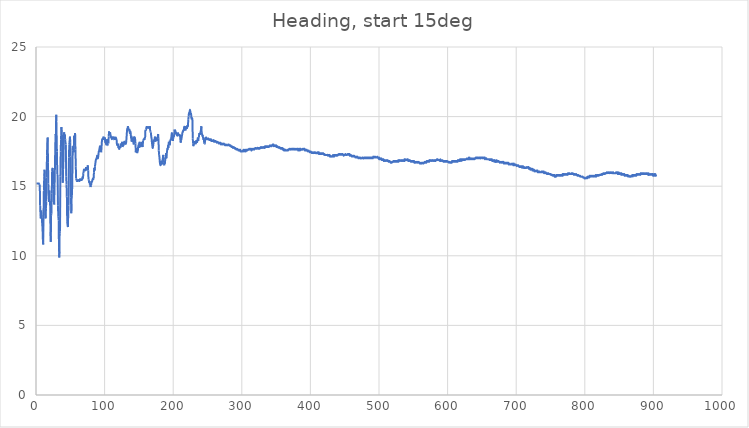
| Category | Column2 |
|---|---|
| 0.5 | 15.188 |
| 1.0 | 15.188 |
| 1.5 | 15.188 |
| 2.0 | 15.188 |
| 2.5 | 15.188 |
| 3.0 | 15.188 |
| 3.5 | 15.188 |
| 4.0 | 15.188 |
| 4.5 | 15.188 |
| 5.0 | 15.125 |
| 5.5 | 15.125 |
| 6.0 | 13.625 |
| 6.5 | 13 |
| 7.0 | 12.688 |
| 7.5 | 13.25 |
| 8.0 | 13.062 |
| 8.5 | 12.75 |
| 9.0 | 12.312 |
| 9.5 | 12 |
| 10.0 | 11.188 |
| 10.5 | 10.812 |
| 11.0 | 13 |
| 11.5 | 14.688 |
| 12.0 | 15.688 |
| 12.5 | 16.188 |
| 13.0 | 15.438 |
| 13.5 | 13 |
| 14.0 | 12.688 |
| 14.5 | 13.375 |
| 15.0 | 13.875 |
| 15.5 | 15.625 |
| 16.0 | 17.188 |
| 16.5 | 18.125 |
| 17.0 | 18.5 |
| 17.5 | 16.688 |
| 18.0 | 15.188 |
| 18.5 | 14.312 |
| 19.0 | 13.875 |
| 19.5 | 14.688 |
| 20.0 | 13.875 |
| 20.5 | 13.938 |
| 21.0 | 12.188 |
| 21.5 | 11 |
| 22.0 | 12.875 |
| 22.5 | 13.062 |
| 23.0 | 14.5 |
| 23.5 | 16.062 |
| 24.0 | 16.312 |
| 24.5 | 16.312 |
| 25.0 | 15.125 |
| 25.5 | 14.75 |
| 26.0 | 14 |
| 26.5 | 13.688 |
| 27.0 | 14.875 |
| 27.5 | 16.125 |
| 28.0 | 17.562 |
| 28.5 | 18.75 |
| 29.0 | 18.688 |
| 29.5 | 20.125 |
| 30.0 | 18.812 |
| 30.5 | 17.5 |
| 31.0 | 15.875 |
| 31.5 | 15.812 |
| 32.0 | 13.625 |
| 32.5 | 12.812 |
| 33.0 | 12.562 |
| 33.5 | 10.625 |
| 34.0 | 9.875 |
| 34.5 | 11.625 |
| 35.0 | 11.75 |
| 35.5 | 15.688 |
| 36.0 | 17.5 |
| 36.5 | 18.375 |
| 37.0 | 19.25 |
| 37.5 | 19.062 |
| 38.0 | 18.25 |
| 38.5 | 16.125 |
| 39.0 | 15.25 |
| 39.5 | 16.188 |
| 40.0 | 16.875 |
| 40.5 | 18.25 |
| 41.0 | 18.875 |
| 41.5 | 18.75 |
| 42.0 | 18.75 |
| 42.5 | 18.375 |
| 43.0 | 18.125 |
| 43.5 | 18 |
| 44.0 | 15.688 |
| 44.5 | 15.125 |
| 45.0 | 14.25 |
| 45.5 | 12.438 |
| 46.0 | 12.188 |
| 46.5 | 12.062 |
| 47.0 | 13 |
| 47.5 | 13.625 |
| 48.0 | 17.062 |
| 48.5 | 18 |
| 49.0 | 18.25 |
| 49.5 | 18.562 |
| 50.0 | 18.125 |
| 50.5 | 17.125 |
| 51.0 | 14.188 |
| 51.5 | 13.062 |
| 52.0 | 14.25 |
| 52.5 | 14.312 |
| 53.0 | 15.812 |
| 53.5 | 17.562 |
| 54.0 | 17.875 |
| 54.5 | 17.875 |
| 55.0 | 17.438 |
| 55.5 | 18.625 |
| 56.0 | 18.188 |
| 56.5 | 18.5 |
| 57.0 | 18.812 |
| 57.5 | 17.625 |
| 58.0 | 16.438 |
| 58.5 | 15.562 |
| 59.0 | 15.438 |
| 59.5 | 15.375 |
| 60.0 | 15.375 |
| 60.5 | 15.375 |
| 61.0 | 15.438 |
| 61.5 | 15.438 |
| 62.0 | 15.438 |
| 62.5 | 15.375 |
| 63.0 | 15.438 |
| 63.5 | 15.375 |
| 64.0 | 15.5 |
| 64.5 | 15.438 |
| 65.0 | 15.5 |
| 65.5 | 15.438 |
| 66.0 | 15.5 |
| 66.5 | 15.438 |
| 67.0 | 15.5 |
| 67.5 | 15.5 |
| 68.0 | 15.688 |
| 68.5 | 15.562 |
| 69.0 | 15.938 |
| 69.5 | 16.062 |
| 70.0 | 16.25 |
| 70.5 | 16.125 |
| 71.0 | 16.188 |
| 71.5 | 16.125 |
| 72.0 | 16.188 |
| 72.5 | 16.125 |
| 73.0 | 16.375 |
| 73.5 | 16.188 |
| 74.0 | 16.25 |
| 74.5 | 16.188 |
| 75.0 | 16.188 |
| 75.5 | 16.5 |
| 76.0 | 16.125 |
| 76.5 | 15.5 |
| 77.0 | 15.438 |
| 77.5 | 15.25 |
| 78.0 | 15.375 |
| 78.5 | 15.125 |
| 79.0 | 15.188 |
| 79.5 | 14.938 |
| 80.0 | 15.062 |
| 80.5 | 15.125 |
| 81.0 | 15.312 |
| 81.5 | 15.312 |
| 82.0 | 15.375 |
| 82.5 | 15.5 |
| 83.0 | 15.562 |
| 83.5 | 15.5 |
| 84.0 | 15.562 |
| 84.5 | 16 |
| 85.0 | 16.312 |
| 85.5 | 16.125 |
| 86.0 | 16.438 |
| 86.5 | 16.625 |
| 87.0 | 16.812 |
| 87.5 | 16.938 |
| 88.0 | 16.938 |
| 88.5 | 17 |
| 89.0 | 17.188 |
| 89.5 | 17.125 |
| 90.0 | 17 |
| 90.5 | 17.062 |
| 91.0 | 17.25 |
| 91.5 | 17.5 |
| 92.0 | 17.5 |
| 92.5 | 17.688 |
| 93.0 | 17.812 |
| 93.5 | 17.875 |
| 94.0 | 17.75 |
| 94.5 | 17.625 |
| 95.0 | 17.438 |
| 95.5 | 17.75 |
| 96.0 | 18.188 |
| 96.5 | 18.375 |
| 97.0 | 18.375 |
| 97.5 | 18.438 |
| 98.0 | 18.438 |
| 98.5 | 18.562 |
| 99.0 | 18.312 |
| 99.5 | 18.312 |
| 100.0 | 18.375 |
| 100.5 | 18.5 |
| 101.0 | 18.125 |
| 101.5 | 18.25 |
| 102.0 | 18 |
| 102.5 | 18.062 |
| 103.0 | 17.938 |
| 103.5 | 18.375 |
| 104.0 | 17.938 |
| 104.5 | 17.938 |
| 105.0 | 18.062 |
| 105.5 | 18.062 |
| 106.0 | 18.562 |
| 106.5 | 18.938 |
| 107.0 | 18.688 |
| 107.5 | 18.75 |
| 108.0 | 18.875 |
| 108.5 | 18.688 |
| 109.0 | 18.625 |
| 109.5 | 18.5 |
| 110.0 | 18.5 |
| 110.5 | 18.375 |
| 111.0 | 18.5 |
| 111.5 | 18.375 |
| 112.0 | 18.562 |
| 112.5 | 18.375 |
| 113.0 | 18.375 |
| 113.5 | 18.5 |
| 114.0 | 18.438 |
| 114.5 | 18.5 |
| 115.0 | 18.375 |
| 115.5 | 18.5 |
| 116.0 | 18.375 |
| 116.5 | 18.5 |
| 117.0 | 18.375 |
| 117.5 | 18.312 |
| 118.0 | 18 |
| 118.5 | 17.938 |
| 119.0 | 18 |
| 119.5 | 18.062 |
| 120.0 | 17.75 |
| 120.5 | 17.75 |
| 121.0 | 17.688 |
| 121.5 | 17.688 |
| 122.0 | 17.812 |
| 122.5 | 17.75 |
| 123.0 | 17.75 |
| 123.5 | 18.062 |
| 124.0 | 17.938 |
| 124.5 | 18 |
| 125.0 | 18 |
| 125.5 | 18.188 |
| 126.0 | 17.812 |
| 126.5 | 18 |
| 127.0 | 18 |
| 127.5 | 17.938 |
| 128.0 | 18.062 |
| 128.5 | 18.188 |
| 129.0 | 18.188 |
| 129.5 | 18.188 |
| 130.0 | 18 |
| 130.5 | 18.125 |
| 131.0 | 18.062 |
| 131.5 | 18.188 |
| 132.0 | 18.5 |
| 132.5 | 18.875 |
| 133.0 | 19.125 |
| 133.5 | 19.125 |
| 134.0 | 19.312 |
| 134.5 | 19.188 |
| 135.0 | 19.062 |
| 135.5 | 19.062 |
| 136.0 | 19.125 |
| 136.5 | 18.875 |
| 137.0 | 18.812 |
| 137.5 | 18.938 |
| 138.0 | 18.875 |
| 138.5 | 18.438 |
| 139.0 | 18.625 |
| 139.5 | 18.188 |
| 140.0 | 18.5 |
| 140.5 | 18.25 |
| 141.0 | 18.438 |
| 141.5 | 18.188 |
| 142.0 | 18.25 |
| 142.5 | 18 |
| 143.0 | 18.562 |
| 143.5 | 18.438 |
| 144.0 | 18.5 |
| 144.5 | 18.375 |
| 145.0 | 18.062 |
| 145.5 | 17.438 |
| 146.0 | 17.75 |
| 146.5 | 17.438 |
| 147.0 | 17.625 |
| 147.5 | 17.375 |
| 148.0 | 17.5 |
| 148.5 | 17.562 |
| 149.0 | 17.875 |
| 149.5 | 17.938 |
| 150.0 | 18.062 |
| 150.5 | 17.75 |
| 151.0 | 18.188 |
| 151.5 | 18 |
| 152.0 | 17.938 |
| 152.5 | 17.875 |
| 153.0 | 17.938 |
| 153.5 | 18 |
| 154.0 | 18.125 |
| 154.5 | 18.062 |
| 155.0 | 17.875 |
| 155.5 | 17.812 |
| 156.0 | 18.25 |
| 156.5 | 18.312 |
| 157.0 | 18.375 |
| 157.5 | 18.375 |
| 158.0 | 18.438 |
| 158.5 | 18.375 |
| 159.0 | 18.438 |
| 159.5 | 19.062 |
| 160.0 | 19.062 |
| 160.5 | 19.062 |
| 161.0 | 19.25 |
| 161.5 | 19.188 |
| 162.0 | 19.25 |
| 162.5 | 19.188 |
| 163.0 | 19.25 |
| 163.5 | 19.188 |
| 164.0 | 19.25 |
| 164.5 | 19.188 |
| 165.0 | 19.25 |
| 165.5 | 19.188 |
| 166.0 | 19.312 |
| 166.5 | 18.938 |
| 167.0 | 18.875 |
| 167.5 | 18.812 |
| 168.0 | 18.562 |
| 168.5 | 18.438 |
| 169.0 | 18.125 |
| 169.5 | 17.938 |
| 170.0 | 17.75 |
| 170.5 | 17.812 |
| 171.0 | 18 |
| 171.5 | 18.188 |
| 172.0 | 18.312 |
| 172.5 | 18.25 |
| 173.0 | 18.438 |
| 173.5 | 18.562 |
| 174.0 | 18.312 |
| 174.5 | 18.25 |
| 175.0 | 18.438 |
| 175.5 | 18.375 |
| 176.0 | 18.438 |
| 176.5 | 18.25 |
| 177.0 | 18.438 |
| 177.5 | 18.562 |
| 178.0 | 18.75 |
| 178.5 | 18.438 |
| 179.0 | 17.562 |
| 179.5 | 17.25 |
| 180.0 | 17.062 |
| 180.5 | 16.75 |
| 181.0 | 16.562 |
| 181.5 | 16.5 |
| 182.0 | 16.562 |
| 182.5 | 16.812 |
| 183.0 | 16.625 |
| 183.5 | 16.562 |
| 184.0 | 16.875 |
| 184.5 | 16.875 |
| 185.0 | 17.062 |
| 185.5 | 17.25 |
| 186.0 | 16.688 |
| 186.5 | 16.562 |
| 187.0 | 16.5 |
| 187.5 | 16.75 |
| 188.0 | 16.625 |
| 188.5 | 17.062 |
| 189.0 | 17 |
| 189.5 | 17.375 |
| 190.0 | 17 |
| 190.5 | 17.25 |
| 191.0 | 17.5 |
| 191.5 | 17.688 |
| 192.0 | 17.625 |
| 192.5 | 17.938 |
| 193.0 | 17.75 |
| 193.5 | 18.188 |
| 194.0 | 18.188 |
| 194.5 | 18.188 |
| 195.0 | 17.938 |
| 195.5 | 18.25 |
| 196.0 | 18.312 |
| 196.5 | 18.375 |
| 197.0 | 18.375 |
| 197.5 | 18.625 |
| 198.0 | 18.812 |
| 198.5 | 18.75 |
| 199.0 | 18.625 |
| 199.5 | 18.25 |
| 200.0 | 18.438 |
| 200.5 | 18.562 |
| 201.0 | 18.562 |
| 201.5 | 18.75 |
| 202.0 | 19.062 |
| 202.5 | 18.938 |
| 203.0 | 19 |
| 203.5 | 18.812 |
| 204.0 | 18.875 |
| 204.5 | 18.812 |
| 205.0 | 18.688 |
| 205.5 | 18.688 |
| 206.0 | 18.625 |
| 206.5 | 18.688 |
| 207.0 | 18.812 |
| 207.5 | 18.75 |
| 208.0 | 18.688 |
| 208.5 | 18.688 |
| 209.0 | 18.625 |
| 209.5 | 18.688 |
| 210.0 | 18.625 |
| 210.5 | 18.312 |
| 211.0 | 18.125 |
| 211.5 | 18.312 |
| 212.0 | 18.375 |
| 212.5 | 18.562 |
| 213.0 | 18.688 |
| 213.5 | 18.875 |
| 214.0 | 18.875 |
| 214.5 | 19 |
| 215.0 | 19 |
| 215.5 | 19.062 |
| 216.0 | 19.25 |
| 216.5 | 19.25 |
| 217.0 | 19.125 |
| 217.5 | 19.125 |
| 218.0 | 19 |
| 218.5 | 19.312 |
| 219.0 | 19.125 |
| 219.5 | 19.25 |
| 220.0 | 19.125 |
| 220.5 | 19.375 |
| 221.0 | 19.25 |
| 221.5 | 19.312 |
| 222.0 | 19.812 |
| 222.5 | 20 |
| 223.0 | 20.25 |
| 223.5 | 20.25 |
| 224.0 | 20.375 |
| 224.5 | 20.5 |
| 225.0 | 20.375 |
| 225.5 | 20.125 |
| 226.0 | 20.25 |
| 226.5 | 19.875 |
| 227.0 | 19.812 |
| 227.5 | 19.938 |
| 228.0 | 19.75 |
| 228.5 | 18.438 |
| 229.0 | 18.062 |
| 229.5 | 17.875 |
| 230.0 | 18.062 |
| 230.5 | 18.062 |
| 231.0 | 18.188 |
| 231.5 | 18.062 |
| 232.0 | 18.188 |
| 232.5 | 18.125 |
| 233.0 | 18.062 |
| 233.5 | 18.125 |
| 234.0 | 18.312 |
| 234.5 | 18.125 |
| 235.0 | 18.188 |
| 235.5 | 18.375 |
| 236.0 | 18.5 |
| 236.5 | 18.25 |
| 237.0 | 18.5 |
| 237.5 | 18.562 |
| 238.0 | 18.812 |
| 238.5 | 18.75 |
| 239.0 | 18.812 |
| 239.5 | 18.75 |
| 240.0 | 18.938 |
| 240.5 | 19.062 |
| 241.0 | 19.312 |
| 241.5 | 18.875 |
| 242.0 | 18.75 |
| 242.5 | 18.625 |
| 243.0 | 18.688 |
| 243.5 | 18.438 |
| 244.0 | 18.375 |
| 244.5 | 18.5 |
| 245.0 | 18.125 |
| 245.5 | 18.062 |
| 246.0 | 18.062 |
| 246.5 | 18.312 |
| 247.0 | 18.375 |
| 247.5 | 18.438 |
| 248.0 | 18.5 |
| 248.5 | 18.375 |
| 249.0 | 18.438 |
| 249.5 | 18.375 |
| 250.0 | 18.438 |
| 250.5 | 18.375 |
| 251.0 | 18.438 |
| 251.5 | 18.375 |
| 252.0 | 18.375 |
| 252.5 | 18.312 |
| 253.0 | 18.375 |
| 253.5 | 18.312 |
| 254.0 | 18.375 |
| 254.5 | 18.312 |
| 255.0 | 18.375 |
| 255.5 | 18.25 |
| 256.0 | 18.25 |
| 256.5 | 18.25 |
| 257.0 | 18.25 |
| 257.5 | 18.25 |
| 258.0 | 18.312 |
| 258.5 | 18.25 |
| 259.0 | 18.312 |
| 259.5 | 18.188 |
| 260.0 | 18.25 |
| 260.5 | 18.188 |
| 261.0 | 18.25 |
| 261.5 | 18.188 |
| 262.0 | 18.25 |
| 262.5 | 18.188 |
| 263.0 | 18.188 |
| 263.5 | 18.125 |
| 264.0 | 18.188 |
| 264.5 | 18.125 |
| 265.0 | 18.188 |
| 265.5 | 18.125 |
| 266.0 | 18.125 |
| 266.5 | 18.062 |
| 267.0 | 18.125 |
| 267.5 | 18.062 |
| 268.0 | 18.125 |
| 268.5 | 18.062 |
| 269.0 | 18.125 |
| 269.5 | 18 |
| 270.0 | 18.062 |
| 270.5 | 18 |
| 271.0 | 18.062 |
| 271.5 | 18 |
| 272.0 | 18.062 |
| 272.5 | 18 |
| 273.0 | 18.062 |
| 273.5 | 18 |
| 274.0 | 18.062 |
| 274.5 | 18 |
| 275.0 | 18 |
| 275.5 | 17.938 |
| 276.0 | 18 |
| 276.5 | 17.938 |
| 277.0 | 18 |
| 277.5 | 17.938 |
| 278.0 | 17.938 |
| 278.5 | 17.938 |
| 279.0 | 17.938 |
| 279.5 | 17.938 |
| 280.0 | 18 |
| 280.5 | 17.938 |
| 281.0 | 18 |
| 281.5 | 17.938 |
| 282.0 | 17.938 |
| 282.5 | 17.938 |
| 283.0 | 17.875 |
| 283.5 | 17.938 |
| 284.0 | 17.875 |
| 284.5 | 17.875 |
| 285.0 | 17.812 |
| 285.5 | 17.875 |
| 286.0 | 17.812 |
| 286.5 | 17.812 |
| 287.0 | 17.75 |
| 287.5 | 17.812 |
| 288.0 | 17.75 |
| 288.5 | 17.812 |
| 289.0 | 17.75 |
| 289.5 | 17.75 |
| 290.0 | 17.688 |
| 290.5 | 17.75 |
| 291.0 | 17.688 |
| 291.5 | 17.688 |
| 292.0 | 17.625 |
| 292.5 | 17.688 |
| 293.0 | 17.625 |
| 293.5 | 17.688 |
| 294.0 | 17.625 |
| 294.5 | 17.625 |
| 295.0 | 17.562 |
| 295.5 | 17.625 |
| 296.0 | 17.562 |
| 296.5 | 17.562 |
| 297.0 | 17.562 |
| 297.5 | 17.625 |
| 298.0 | 17.5 |
| 298.5 | 17.562 |
| 299.0 | 17.5 |
| 299.5 | 17.5 |
| 300.0 | 17.5 |
| 300.5 | 17.5 |
| 301.0 | 17.5 |
| 301.5 | 17.562 |
| 302.0 | 17.5 |
| 302.5 | 17.625 |
| 303.0 | 17.5 |
| 303.5 | 17.625 |
| 304.0 | 17.5 |
| 304.5 | 17.562 |
| 305.0 | 17.5 |
| 305.5 | 17.625 |
| 306.0 | 17.5 |
| 306.5 | 17.625 |
| 307.0 | 17.562 |
| 307.5 | 17.625 |
| 308.0 | 17.562 |
| 308.5 | 17.625 |
| 309.0 | 17.625 |
| 309.5 | 17.625 |
| 310.0 | 17.625 |
| 310.5 | 17.688 |
| 311.0 | 17.625 |
| 311.5 | 17.688 |
| 312.0 | 17.625 |
| 312.5 | 17.688 |
| 313.0 | 17.625 |
| 313.5 | 17.688 |
| 314.0 | 17.562 |
| 314.5 | 17.625 |
| 315.0 | 17.625 |
| 315.5 | 17.688 |
| 316.0 | 17.625 |
| 316.5 | 17.688 |
| 317.0 | 17.625 |
| 317.5 | 17.688 |
| 318.0 | 17.625 |
| 318.5 | 17.688 |
| 319.0 | 17.688 |
| 319.5 | 17.75 |
| 320.0 | 17.688 |
| 320.5 | 17.75 |
| 321.0 | 17.688 |
| 321.5 | 17.688 |
| 322.0 | 17.688 |
| 322.5 | 17.75 |
| 323.0 | 17.75 |
| 323.5 | 17.75 |
| 324.0 | 17.688 |
| 324.5 | 17.75 |
| 325.0 | 17.688 |
| 325.5 | 17.75 |
| 326.0 | 17.688 |
| 326.5 | 17.75 |
| 327.0 | 17.75 |
| 327.5 | 17.812 |
| 328.0 | 17.75 |
| 328.5 | 17.75 |
| 329.0 | 17.812 |
| 329.5 | 17.75 |
| 330.0 | 17.812 |
| 330.5 | 17.75 |
| 331.0 | 17.812 |
| 331.5 | 17.75 |
| 332.0 | 17.812 |
| 332.5 | 17.75 |
| 333.0 | 17.812 |
| 333.5 | 17.75 |
| 334.0 | 17.875 |
| 334.5 | 17.812 |
| 335.0 | 17.875 |
| 335.5 | 17.812 |
| 336.0 | 17.875 |
| 336.5 | 17.812 |
| 337.0 | 17.875 |
| 337.5 | 17.812 |
| 338.0 | 17.875 |
| 338.5 | 17.812 |
| 339.0 | 17.875 |
| 339.5 | 17.812 |
| 340.0 | 17.875 |
| 340.5 | 17.875 |
| 341.0 | 17.938 |
| 341.5 | 17.875 |
| 342.0 | 17.938 |
| 342.5 | 17.875 |
| 343.0 | 17.875 |
| 343.5 | 17.875 |
| 344.0 | 17.938 |
| 344.5 | 17.938 |
| 345.0 | 18 |
| 345.5 | 17.938 |
| 346.0 | 18 |
| 346.5 | 17.875 |
| 347.0 | 17.938 |
| 347.5 | 17.875 |
| 348.0 | 17.938 |
| 348.5 | 17.875 |
| 349.0 | 17.938 |
| 349.5 | 17.875 |
| 350.0 | 17.938 |
| 350.5 | 17.812 |
| 351.0 | 17.875 |
| 351.5 | 17.812 |
| 352.0 | 17.875 |
| 352.5 | 17.812 |
| 353.0 | 17.812 |
| 353.5 | 17.75 |
| 354.0 | 17.812 |
| 354.5 | 17.75 |
| 355.0 | 17.812 |
| 355.5 | 17.75 |
| 356.0 | 17.75 |
| 356.5 | 17.688 |
| 357.0 | 17.75 |
| 357.5 | 17.688 |
| 358.0 | 17.75 |
| 358.5 | 17.688 |
| 359.0 | 17.75 |
| 359.5 | 17.625 |
| 360.0 | 17.688 |
| 360.5 | 17.625 |
| 361.0 | 17.688 |
| 361.5 | 17.562 |
| 362.0 | 17.625 |
| 362.5 | 17.562 |
| 363.0 | 17.625 |
| 363.5 | 17.562 |
| 364.0 | 17.625 |
| 364.5 | 17.562 |
| 365.0 | 17.562 |
| 365.5 | 17.562 |
| 366.0 | 17.562 |
| 366.5 | 17.562 |
| 367.0 | 17.625 |
| 367.5 | 17.562 |
| 368.0 | 17.625 |
| 368.5 | 17.625 |
| 369.0 | 17.688 |
| 369.5 | 17.625 |
| 370.0 | 17.688 |
| 370.5 | 17.625 |
| 371.0 | 17.688 |
| 371.5 | 17.625 |
| 372.0 | 17.688 |
| 372.5 | 17.625 |
| 373.0 | 17.688 |
| 373.5 | 17.625 |
| 374.0 | 17.688 |
| 374.5 | 17.688 |
| 375.0 | 17.688 |
| 375.5 | 17.688 |
| 376.0 | 17.625 |
| 376.5 | 17.688 |
| 377.0 | 17.625 |
| 377.5 | 17.688 |
| 378.0 | 17.625 |
| 378.5 | 17.688 |
| 379.0 | 17.625 |
| 379.5 | 17.688 |
| 380.0 | 17.625 |
| 380.5 | 17.688 |
| 381.0 | 17.625 |
| 381.5 | 17.688 |
| 382.0 | 17.562 |
| 382.5 | 17.688 |
| 383.0 | 17.562 |
| 383.5 | 17.688 |
| 384.0 | 17.562 |
| 384.5 | 17.688 |
| 385.0 | 17.562 |
| 385.5 | 17.688 |
| 386.0 | 17.625 |
| 386.5 | 17.625 |
| 387.0 | 17.625 |
| 387.5 | 17.625 |
| 388.0 | 17.625 |
| 388.5 | 17.688 |
| 389.0 | 17.625 |
| 389.5 | 17.688 |
| 390.0 | 17.625 |
| 390.5 | 17.688 |
| 391.0 | 17.625 |
| 391.5 | 17.688 |
| 392.0 | 17.562 |
| 392.5 | 17.625 |
| 393.0 | 17.562 |
| 393.5 | 17.625 |
| 394.0 | 17.562 |
| 394.5 | 17.625 |
| 395.0 | 17.562 |
| 395.5 | 17.562 |
| 396.0 | 17.5 |
| 396.5 | 17.562 |
| 397.0 | 17.5 |
| 397.5 | 17.562 |
| 398.0 | 17.5 |
| 398.5 | 17.5 |
| 399.0 | 17.438 |
| 399.5 | 17.5 |
| 400.0 | 17.438 |
| 400.5 | 17.5 |
| 401.0 | 17.438 |
| 401.5 | 17.438 |
| 402.0 | 17.375 |
| 402.5 | 17.438 |
| 403.0 | 17.375 |
| 403.5 | 17.438 |
| 404.0 | 17.375 |
| 404.5 | 17.438 |
| 405.0 | 17.375 |
| 405.5 | 17.438 |
| 406.0 | 17.375 |
| 406.5 | 17.438 |
| 407.0 | 17.375 |
| 407.5 | 17.438 |
| 408.0 | 17.375 |
| 408.5 | 17.375 |
| 409.0 | 17.375 |
| 409.5 | 17.375 |
| 410.0 | 17.375 |
| 410.5 | 17.438 |
| 411.0 | 17.375 |
| 411.5 | 17.438 |
| 412.0 | 17.312 |
| 412.5 | 17.438 |
| 413.0 | 17.312 |
| 413.5 | 17.375 |
| 414.0 | 17.312 |
| 414.5 | 17.375 |
| 415.0 | 17.312 |
| 415.5 | 17.375 |
| 416.0 | 17.312 |
| 416.5 | 17.375 |
| 417.0 | 17.312 |
| 417.5 | 17.375 |
| 418.0 | 17.312 |
| 418.5 | 17.375 |
| 419.0 | 17.312 |
| 419.5 | 17.312 |
| 420.0 | 17.25 |
| 420.5 | 17.312 |
| 421.0 | 17.25 |
| 421.5 | 17.25 |
| 422.0 | 17.25 |
| 422.5 | 17.25 |
| 423.0 | 17.25 |
| 423.5 | 17.25 |
| 424.0 | 17.25 |
| 424.5 | 17.25 |
| 425.0 | 17.25 |
| 425.5 | 17.188 |
| 426.0 | 17.25 |
| 426.5 | 17.188 |
| 427.0 | 17.25 |
| 427.5 | 17.188 |
| 428.0 | 17.25 |
| 428.5 | 17.125 |
| 429.0 | 17.188 |
| 429.5 | 17.125 |
| 430.0 | 17.125 |
| 430.5 | 17.125 |
| 431.0 | 17.125 |
| 431.5 | 17.125 |
| 432.0 | 17.188 |
| 432.5 | 17.125 |
| 433.0 | 17.25 |
| 433.5 | 17.125 |
| 434.0 | 17.188 |
| 434.5 | 17.125 |
| 435.0 | 17.25 |
| 435.5 | 17.188 |
| 436.0 | 17.25 |
| 436.5 | 17.188 |
| 437.0 | 17.25 |
| 437.5 | 17.188 |
| 438.0 | 17.25 |
| 438.5 | 17.188 |
| 439.0 | 17.25 |
| 439.5 | 17.188 |
| 440.0 | 17.25 |
| 440.5 | 17.25 |
| 441.0 | 17.312 |
| 441.5 | 17.25 |
| 442.0 | 17.312 |
| 442.5 | 17.25 |
| 443.0 | 17.312 |
| 443.5 | 17.25 |
| 444.0 | 17.312 |
| 444.5 | 17.25 |
| 445.0 | 17.312 |
| 445.5 | 17.25 |
| 446.0 | 17.312 |
| 446.5 | 17.25 |
| 447.0 | 17.312 |
| 447.5 | 17.25 |
| 448.0 | 17.25 |
| 448.5 | 17.188 |
| 449.0 | 17.25 |
| 449.5 | 17.25 |
| 450.0 | 17.25 |
| 450.5 | 17.25 |
| 451.0 | 17.312 |
| 451.5 | 17.25 |
| 452.0 | 17.25 |
| 452.5 | 17.25 |
| 453.0 | 17.25 |
| 453.5 | 17.25 |
| 454.0 | 17.312 |
| 454.5 | 17.25 |
| 455.0 | 17.312 |
| 455.5 | 17.25 |
| 456.0 | 17.312 |
| 456.5 | 17.25 |
| 457.0 | 17.312 |
| 457.5 | 17.188 |
| 458.0 | 17.25 |
| 458.5 | 17.188 |
| 459.0 | 17.25 |
| 459.5 | 17.188 |
| 460.0 | 17.188 |
| 460.5 | 17.125 |
| 461.0 | 17.188 |
| 461.5 | 17.125 |
| 462.0 | 17.188 |
| 462.5 | 17.125 |
| 463.0 | 17.188 |
| 463.5 | 17.125 |
| 464.0 | 17.188 |
| 464.5 | 17.125 |
| 465.0 | 17.125 |
| 465.5 | 17.062 |
| 466.0 | 17.125 |
| 466.5 | 17.062 |
| 467.0 | 17.125 |
| 467.5 | 17.062 |
| 468.0 | 17.062 |
| 468.5 | 17.125 |
| 469.0 | 17.062 |
| 469.5 | 17.062 |
| 470.0 | 17 |
| 470.5 | 17.062 |
| 471.0 | 17.062 |
| 471.5 | 17.062 |
| 472.0 | 17 |
| 472.5 | 17.062 |
| 473.0 | 17 |
| 473.5 | 17 |
| 474.0 | 17 |
| 474.5 | 17 |
| 475.0 | 17 |
| 475.5 | 17.062 |
| 476.0 | 17 |
| 476.5 | 17.062 |
| 477.0 | 17 |
| 477.5 | 17 |
| 478.0 | 17 |
| 478.5 | 17.062 |
| 479.0 | 17 |
| 479.5 | 17.062 |
| 480.0 | 17 |
| 480.5 | 17.062 |
| 481.0 | 17 |
| 481.5 | 17.062 |
| 482.0 | 17 |
| 482.5 | 17.062 |
| 483.0 | 17 |
| 483.5 | 17.062 |
| 484.0 | 17 |
| 484.5 | 17.062 |
| 485.0 | 17 |
| 485.5 | 17.062 |
| 486.0 | 17 |
| 486.5 | 17.062 |
| 487.0 | 17 |
| 487.5 | 17.062 |
| 488.0 | 17 |
| 488.5 | 17.062 |
| 489.0 | 17 |
| 489.5 | 17.062 |
| 490.0 | 17 |
| 490.5 | 17.062 |
| 491.0 | 17 |
| 491.5 | 17.125 |
| 492.0 | 17.062 |
| 492.5 | 17.125 |
| 493.0 | 17.062 |
| 493.5 | 17.125 |
| 494.0 | 17.062 |
| 494.5 | 17.125 |
| 495.0 | 17.062 |
| 495.5 | 17.062 |
| 496.0 | 17.062 |
| 496.5 | 17.062 |
| 497.0 | 17.062 |
| 497.5 | 17.125 |
| 498.0 | 17.062 |
| 498.5 | 17.062 |
| 499.0 | 17 |
| 499.5 | 17.062 |
| 500.0 | 16.938 |
| 500.5 | 17.062 |
| 501.0 | 16.938 |
| 501.5 | 17 |
| 502.0 | 16.938 |
| 502.5 | 17 |
| 503.0 | 16.938 |
| 503.5 | 17 |
| 504.0 | 16.875 |
| 504.5 | 16.938 |
| 505.0 | 16.875 |
| 505.5 | 16.938 |
| 506.0 | 16.875 |
| 506.5 | 16.938 |
| 507.0 | 16.812 |
| 507.5 | 16.875 |
| 508.0 | 16.812 |
| 508.5 | 16.875 |
| 509.0 | 16.812 |
| 509.5 | 16.875 |
| 510.0 | 16.812 |
| 510.5 | 16.875 |
| 511.0 | 16.812 |
| 511.5 | 16.875 |
| 512.0 | 16.812 |
| 512.5 | 16.875 |
| 513.0 | 16.812 |
| 513.5 | 16.812 |
| 514.0 | 16.75 |
| 514.5 | 16.812 |
| 515.0 | 16.75 |
| 515.5 | 16.812 |
| 516.0 | 16.75 |
| 516.5 | 16.75 |
| 517.0 | 16.688 |
| 517.5 | 16.688 |
| 518.0 | 16.688 |
| 518.5 | 16.688 |
| 519.0 | 16.75 |
| 519.5 | 16.75 |
| 520.0 | 16.75 |
| 520.5 | 16.75 |
| 521.0 | 16.812 |
| 521.5 | 16.75 |
| 522.0 | 16.812 |
| 522.5 | 16.75 |
| 523.0 | 16.812 |
| 523.5 | 16.75 |
| 524.0 | 16.812 |
| 524.5 | 16.75 |
| 525.0 | 16.812 |
| 525.5 | 16.75 |
| 526.0 | 16.812 |
| 526.5 | 16.75 |
| 527.0 | 16.812 |
| 527.5 | 16.75 |
| 528.0 | 16.875 |
| 528.5 | 16.75 |
| 529.0 | 16.875 |
| 529.5 | 16.812 |
| 530.0 | 16.875 |
| 530.5 | 16.812 |
| 531.0 | 16.875 |
| 531.5 | 16.812 |
| 532.0 | 16.875 |
| 532.5 | 16.812 |
| 533.0 | 16.875 |
| 533.5 | 16.812 |
| 534.0 | 16.875 |
| 534.5 | 16.812 |
| 535.0 | 16.875 |
| 535.5 | 16.812 |
| 536.0 | 16.875 |
| 536.5 | 16.812 |
| 537.0 | 16.938 |
| 537.5 | 16.812 |
| 538.0 | 16.938 |
| 538.5 | 16.875 |
| 539.0 | 16.875 |
| 539.5 | 16.875 |
| 540.0 | 16.875 |
| 540.5 | 16.875 |
| 541.0 | 16.938 |
| 541.5 | 16.875 |
| 542.0 | 16.938 |
| 542.5 | 16.812 |
| 543.0 | 16.875 |
| 543.5 | 16.812 |
| 544.0 | 16.875 |
| 544.5 | 16.812 |
| 545.0 | 16.875 |
| 545.5 | 16.812 |
| 546.0 | 16.812 |
| 546.5 | 16.75 |
| 547.0 | 16.812 |
| 547.5 | 16.75 |
| 548.0 | 16.812 |
| 548.5 | 16.75 |
| 549.0 | 16.812 |
| 549.5 | 16.75 |
| 550.0 | 16.812 |
| 550.5 | 16.75 |
| 551.0 | 16.812 |
| 551.5 | 16.688 |
| 552.0 | 16.75 |
| 552.5 | 16.688 |
| 553.0 | 16.75 |
| 553.5 | 16.688 |
| 554.0 | 16.75 |
| 554.5 | 16.688 |
| 555.0 | 16.75 |
| 555.5 | 16.688 |
| 556.0 | 16.75 |
| 556.5 | 16.688 |
| 557.0 | 16.75 |
| 557.5 | 16.688 |
| 558.0 | 16.75 |
| 558.5 | 16.688 |
| 559.0 | 16.688 |
| 559.5 | 16.625 |
| 560.0 | 16.688 |
| 560.5 | 16.625 |
| 561.0 | 16.625 |
| 561.5 | 16.625 |
| 562.0 | 16.625 |
| 562.5 | 16.688 |
| 563.0 | 16.688 |
| 563.5 | 16.688 |
| 564.0 | 16.625 |
| 564.5 | 16.688 |
| 565.0 | 16.625 |
| 565.5 | 16.688 |
| 566.0 | 16.688 |
| 566.5 | 16.75 |
| 567.0 | 16.688 |
| 567.5 | 16.75 |
| 568.0 | 16.688 |
| 568.5 | 16.75 |
| 569.0 | 16.688 |
| 569.5 | 16.812 |
| 570.0 | 16.75 |
| 570.5 | 16.812 |
| 571.0 | 16.75 |
| 571.5 | 16.812 |
| 572.0 | 16.75 |
| 572.5 | 16.812 |
| 573.0 | 16.75 |
| 573.5 | 16.875 |
| 574.0 | 16.812 |
| 574.5 | 16.875 |
| 575.0 | 16.812 |
| 575.5 | 16.875 |
| 576.0 | 16.812 |
| 576.5 | 16.875 |
| 577.0 | 16.812 |
| 577.5 | 16.875 |
| 578.0 | 16.812 |
| 578.5 | 16.875 |
| 579.0 | 16.812 |
| 579.5 | 16.875 |
| 580.0 | 16.812 |
| 580.5 | 16.875 |
| 581.0 | 16.812 |
| 581.5 | 16.875 |
| 582.0 | 16.812 |
| 582.5 | 16.812 |
| 583.0 | 16.875 |
| 583.5 | 16.875 |
| 584.0 | 16.875 |
| 584.5 | 16.938 |
| 585.0 | 16.875 |
| 585.5 | 16.938 |
| 586.0 | 16.875 |
| 586.5 | 16.875 |
| 587.0 | 16.875 |
| 587.5 | 16.875 |
| 588.0 | 16.875 |
| 588.5 | 16.875 |
| 589.0 | 16.812 |
| 589.5 | 16.938 |
| 590.0 | 16.812 |
| 590.5 | 16.875 |
| 591.0 | 16.812 |
| 591.5 | 16.875 |
| 592.0 | 16.812 |
| 592.5 | 16.875 |
| 593.0 | 16.812 |
| 593.5 | 16.812 |
| 594.0 | 16.75 |
| 594.5 | 16.812 |
| 595.0 | 16.75 |
| 595.5 | 16.812 |
| 596.0 | 16.75 |
| 596.5 | 16.812 |
| 597.0 | 16.75 |
| 597.5 | 16.812 |
| 598.0 | 16.75 |
| 598.5 | 16.812 |
| 599.0 | 16.75 |
| 599.5 | 16.812 |
| 600.0 | 16.75 |
| 600.5 | 16.75 |
| 601.0 | 16.75 |
| 601.5 | 16.75 |
| 602.0 | 16.688 |
| 602.5 | 16.75 |
| 603.0 | 16.688 |
| 603.5 | 16.75 |
| 604.0 | 16.688 |
| 604.5 | 16.688 |
| 605.0 | 16.688 |
| 605.5 | 16.688 |
| 606.0 | 16.688 |
| 606.5 | 16.812 |
| 607.0 | 16.75 |
| 607.5 | 16.812 |
| 608.0 | 16.75 |
| 608.5 | 16.812 |
| 609.0 | 16.75 |
| 609.5 | 16.812 |
| 610.0 | 16.812 |
| 610.5 | 16.75 |
| 611.0 | 16.812 |
| 611.5 | 16.75 |
| 612.0 | 16.812 |
| 612.5 | 16.75 |
| 613.0 | 16.812 |
| 613.5 | 16.75 |
| 614.0 | 16.812 |
| 614.5 | 16.75 |
| 615.0 | 16.875 |
| 615.5 | 16.812 |
| 616.0 | 16.875 |
| 616.5 | 16.812 |
| 617.0 | 16.875 |
| 617.5 | 16.812 |
| 618.0 | 16.938 |
| 618.5 | 16.812 |
| 619.0 | 16.938 |
| 619.5 | 16.875 |
| 620.0 | 16.938 |
| 620.5 | 16.812 |
| 621.0 | 16.938 |
| 621.5 | 16.875 |
| 622.0 | 16.938 |
| 622.5 | 16.875 |
| 623.0 | 16.938 |
| 623.5 | 16.875 |
| 624.0 | 16.938 |
| 624.5 | 16.875 |
| 625.0 | 16.938 |
| 625.5 | 16.875 |
| 626.0 | 16.938 |
| 626.5 | 16.938 |
| 627.0 | 16.938 |
| 627.5 | 16.938 |
| 628.0 | 17 |
| 628.5 | 16.938 |
| 629.0 | 17 |
| 629.5 | 16.938 |
| 630.0 | 17 |
| 630.5 | 16.938 |
| 631.0 | 17.062 |
| 631.5 | 16.938 |
| 632.0 | 17.062 |
| 632.5 | 16.938 |
| 633.0 | 17 |
| 633.5 | 16.938 |
| 634.0 | 17 |
| 634.5 | 16.938 |
| 635.0 | 17 |
| 635.5 | 16.938 |
| 636.0 | 17 |
| 636.5 | 16.938 |
| 637.0 | 17 |
| 637.5 | 16.938 |
| 638.0 | 17 |
| 638.5 | 16.938 |
| 639.0 | 17 |
| 639.5 | 16.938 |
| 640.0 | 17 |
| 640.5 | 17 |
| 641.0 | 17.062 |
| 641.5 | 17 |
| 642.0 | 17.062 |
| 642.5 | 17 |
| 643.0 | 17.062 |
| 643.5 | 17 |
| 644.0 | 17.062 |
| 644.5 | 17 |
| 645.0 | 17.062 |
| 645.5 | 17 |
| 646.0 | 17.062 |
| 646.5 | 17 |
| 647.0 | 17.062 |
| 647.5 | 17 |
| 648.0 | 17 |
| 648.5 | 17.062 |
| 649.0 | 17.062 |
| 649.5 | 17.062 |
| 650.0 | 17.062 |
| 650.5 | 17 |
| 651.0 | 17.062 |
| 651.5 | 17 |
| 652.0 | 17.062 |
| 652.5 | 17 |
| 653.0 | 17.062 |
| 653.5 | 17 |
| 654.0 | 17.062 |
| 654.5 | 16.938 |
| 655.0 | 17 |
| 655.5 | 17 |
| 656.0 | 17 |
| 656.5 | 17 |
| 657.0 | 16.938 |
| 657.5 | 16.938 |
| 658.0 | 16.938 |
| 658.5 | 16.938 |
| 659.0 | 16.938 |
| 659.5 | 16.938 |
| 660.0 | 16.938 |
| 660.5 | 16.938 |
| 661.0 | 16.875 |
| 661.5 | 16.938 |
| 662.0 | 16.875 |
| 662.5 | 16.938 |
| 663.0 | 16.875 |
| 663.5 | 16.938 |
| 664.0 | 16.875 |
| 664.5 | 16.938 |
| 665.0 | 16.812 |
| 665.5 | 16.875 |
| 666.0 | 16.812 |
| 666.5 | 16.875 |
| 667.0 | 16.812 |
| 667.5 | 16.875 |
| 668.0 | 16.75 |
| 668.5 | 16.875 |
| 669.0 | 16.812 |
| 669.5 | 16.75 |
| 670.0 | 16.75 |
| 670.5 | 16.75 |
| 671.0 | 16.75 |
| 671.5 | 16.875 |
| 672.0 | 16.75 |
| 672.5 | 16.812 |
| 673.0 | 16.75 |
| 673.5 | 16.812 |
| 674.0 | 16.75 |
| 674.5 | 16.812 |
| 675.0 | 16.75 |
| 675.5 | 16.75 |
| 676.0 | 16.688 |
| 676.5 | 16.75 |
| 677.0 | 16.688 |
| 677.5 | 16.75 |
| 678.0 | 16.688 |
| 678.5 | 16.75 |
| 679.0 | 16.688 |
| 679.5 | 16.75 |
| 680.0 | 16.688 |
| 680.5 | 16.75 |
| 681.0 | 16.688 |
| 681.5 | 16.75 |
| 682.0 | 16.625 |
| 682.5 | 16.688 |
| 683.0 | 16.625 |
| 683.5 | 16.688 |
| 684.0 | 16.625 |
| 684.5 | 16.688 |
| 685.0 | 16.625 |
| 685.5 | 16.688 |
| 686.0 | 16.625 |
| 686.5 | 16.688 |
| 687.0 | 16.625 |
| 687.5 | 16.688 |
| 688.0 | 16.625 |
| 688.5 | 16.688 |
| 689.0 | 16.562 |
| 689.5 | 16.625 |
| 690.0 | 16.562 |
| 690.5 | 16.625 |
| 691.0 | 16.562 |
| 691.5 | 16.562 |
| 692.0 | 16.562 |
| 692.5 | 16.562 |
| 693.0 | 16.562 |
| 693.5 | 16.625 |
| 694.0 | 16.562 |
| 694.5 | 16.625 |
| 695.0 | 16.562 |
| 695.5 | 16.562 |
| 696.0 | 16.5 |
| 696.5 | 16.625 |
| 697.0 | 16.562 |
| 697.5 | 16.562 |
| 698.0 | 16.5 |
| 698.5 | 16.562 |
| 699.0 | 16.5 |
| 699.5 | 16.562 |
| 700.0 | 16.5 |
| 700.5 | 16.5 |
| 701.0 | 16.438 |
| 701.5 | 16.5 |
| 702.0 | 16.5 |
| 702.5 | 16.5 |
| 703.0 | 16.5 |
| 703.5 | 16.438 |
| 704.0 | 16.438 |
| 704.5 | 16.375 |
| 705.0 | 16.438 |
| 705.5 | 16.375 |
| 706.0 | 16.438 |
| 706.5 | 16.375 |
| 707.0 | 16.438 |
| 707.5 | 16.375 |
| 708.0 | 16.438 |
| 708.5 | 16.312 |
| 709.0 | 16.438 |
| 709.5 | 16.375 |
| 710.0 | 16.438 |
| 710.5 | 16.312 |
| 711.0 | 16.375 |
| 711.5 | 16.312 |
| 712.0 | 16.375 |
| 712.5 | 16.312 |
| 713.0 | 16.312 |
| 713.5 | 16.312 |
| 714.0 | 16.312 |
| 714.5 | 16.312 |
| 715.0 | 16.375 |
| 715.5 | 16.312 |
| 716.0 | 16.375 |
| 716.5 | 16.312 |
| 717.0 | 16.375 |
| 717.5 | 16.312 |
| 718.0 | 16.375 |
| 718.5 | 16.25 |
| 719.0 | 16.312 |
| 719.5 | 16.25 |
| 720.0 | 16.312 |
| 720.5 | 16.188 |
| 721.0 | 16.25 |
| 721.5 | 16.188 |
| 722.0 | 16.25 |
| 722.5 | 16.188 |
| 723.0 | 16.25 |
| 723.5 | 16.125 |
| 724.0 | 16.25 |
| 724.5 | 16.125 |
| 725.0 | 16.188 |
| 725.5 | 16.125 |
| 726.0 | 16.188 |
| 726.5 | 16.062 |
| 727.0 | 16.125 |
| 727.5 | 16.062 |
| 728.0 | 16.125 |
| 728.5 | 16.062 |
| 729.0 | 16.125 |
| 729.5 | 16.062 |
| 730.0 | 16.125 |
| 730.5 | 16.062 |
| 731.0 | 16.125 |
| 731.5 | 16 |
| 732.0 | 16.062 |
| 732.5 | 16 |
| 733.0 | 16.062 |
| 733.5 | 16 |
| 734.0 | 16.062 |
| 734.5 | 16 |
| 735.0 | 16 |
| 735.5 | 16 |
| 736.0 | 16 |
| 736.5 | 16 |
| 737.0 | 16.062 |
| 737.5 | 16 |
| 738.0 | 16.062 |
| 738.5 | 16 |
| 739.0 | 16.062 |
| 739.5 | 16 |
| 740.0 | 16.062 |
| 740.5 | 15.938 |
| 741.0 | 16 |
| 741.5 | 15.938 |
| 742.0 | 16 |
| 742.5 | 15.938 |
| 743.0 | 16 |
| 743.5 | 15.938 |
| 744.0 | 15.938 |
| 744.5 | 15.875 |
| 745.0 | 15.938 |
| 745.5 | 15.875 |
| 746.0 | 15.938 |
| 746.5 | 15.875 |
| 747.0 | 15.938 |
| 747.5 | 15.875 |
| 748.0 | 15.875 |
| 748.5 | 15.875 |
| 749.0 | 15.875 |
| 749.5 | 15.875 |
| 750.0 | 15.812 |
| 750.5 | 15.875 |
| 751.0 | 15.812 |
| 751.5 | 15.812 |
| 752.0 | 15.812 |
| 752.5 | 15.812 |
| 753.0 | 15.75 |
| 753.5 | 15.812 |
| 754.0 | 15.75 |
| 754.5 | 15.812 |
| 755.0 | 15.75 |
| 755.5 | 15.812 |
| 756.0 | 15.688 |
| 756.5 | 15.688 |
| 757.0 | 15.688 |
| 757.5 | 15.688 |
| 758.0 | 15.688 |
| 758.5 | 15.812 |
| 759.0 | 15.75 |
| 759.5 | 15.812 |
| 760.0 | 15.75 |
| 760.5 | 15.812 |
| 761.0 | 15.75 |
| 761.5 | 15.812 |
| 762.0 | 15.75 |
| 762.5 | 15.812 |
| 763.0 | 15.75 |
| 763.5 | 15.812 |
| 764.0 | 15.75 |
| 764.5 | 15.812 |
| 765.0 | 15.75 |
| 765.5 | 15.812 |
| 766.0 | 15.75 |
| 766.5 | 15.812 |
| 767.0 | 15.75 |
| 767.5 | 15.875 |
| 768.0 | 15.75 |
| 768.5 | 15.875 |
| 769.0 | 15.812 |
| 769.5 | 15.875 |
| 770.0 | 15.812 |
| 770.5 | 15.875 |
| 771.0 | 15.812 |
| 771.5 | 15.875 |
| 772.0 | 15.812 |
| 772.5 | 15.875 |
| 773.0 | 15.812 |
| 773.5 | 15.875 |
| 774.0 | 15.812 |
| 774.5 | 15.875 |
| 775.0 | 15.812 |
| 775.5 | 15.938 |
| 776.0 | 15.875 |
| 776.5 | 15.938 |
| 777.0 | 15.875 |
| 777.5 | 15.938 |
| 778.0 | 15.875 |
| 778.5 | 15.875 |
| 779.0 | 15.875 |
| 779.5 | 15.875 |
| 780.0 | 15.875 |
| 780.5 | 15.938 |
| 781.0 | 15.875 |
| 781.5 | 15.938 |
| 782.0 | 15.875 |
| 782.5 | 15.938 |
| 783.0 | 15.875 |
| 783.5 | 15.875 |
| 784.0 | 15.812 |
| 784.5 | 15.875 |
| 785.0 | 15.812 |
| 785.5 | 15.875 |
| 786.0 | 15.812 |
| 786.5 | 15.875 |
| 787.0 | 15.812 |
| 787.5 | 15.875 |
| 788.0 | 15.812 |
| 788.5 | 15.812 |
| 789.0 | 15.75 |
| 789.5 | 15.812 |
| 790.0 | 15.75 |
| 790.5 | 15.812 |
| 791.0 | 15.75 |
| 791.5 | 15.75 |
| 792.0 | 15.75 |
| 792.5 | 15.75 |
| 793.0 | 15.688 |
| 793.5 | 15.75 |
| 794.0 | 15.688 |
| 794.5 | 15.688 |
| 795.0 | 15.688 |
| 795.5 | 15.688 |
| 796.0 | 15.688 |
| 796.5 | 15.688 |
| 797.0 | 15.688 |
| 797.5 | 15.625 |
| 798.0 | 15.625 |
| 798.5 | 15.625 |
| 799.0 | 15.625 |
| 799.5 | 15.562 |
| 800.0 | 15.562 |
| 800.5 | 15.562 |
| 801.0 | 15.562 |
| 801.5 | 15.562 |
| 802.0 | 15.625 |
| 802.5 | 15.562 |
| 803.0 | 15.625 |
| 803.5 | 15.562 |
| 804.0 | 15.688 |
| 804.5 | 15.625 |
| 805.0 | 15.688 |
| 805.5 | 15.625 |
| 806.0 | 15.688 |
| 806.5 | 15.625 |
| 807.0 | 15.75 |
| 807.5 | 15.688 |
| 808.0 | 15.75 |
| 808.5 | 15.688 |
| 809.0 | 15.75 |
| 809.5 | 15.688 |
| 810.0 | 15.75 |
| 810.5 | 15.688 |
| 811.0 | 15.75 |
| 811.5 | 15.688 |
| 812.0 | 15.75 |
| 812.5 | 15.688 |
| 813.0 | 15.75 |
| 813.5 | 15.688 |
| 814.0 | 15.75 |
| 814.5 | 15.688 |
| 815.0 | 15.75 |
| 815.5 | 15.688 |
| 816.0 | 15.812 |
| 816.5 | 15.688 |
| 817.0 | 15.75 |
| 817.5 | 15.75 |
| 818.0 | 15.812 |
| 818.5 | 15.75 |
| 819.0 | 15.812 |
| 819.5 | 15.75 |
| 820.0 | 15.812 |
| 820.5 | 15.75 |
| 821.0 | 15.812 |
| 821.5 | 15.812 |
| 822.0 | 15.812 |
| 822.5 | 15.812 |
| 823.0 | 15.812 |
| 823.5 | 15.812 |
| 824.0 | 15.875 |
| 824.5 | 15.812 |
| 825.0 | 15.875 |
| 825.5 | 15.812 |
| 826.0 | 15.875 |
| 826.5 | 15.875 |
| 827.0 | 15.938 |
| 827.5 | 15.875 |
| 828.0 | 15.938 |
| 828.5 | 15.875 |
| 829.0 | 15.938 |
| 829.5 | 15.875 |
| 830.0 | 15.938 |
| 830.5 | 15.938 |
| 831.0 | 15.938 |
| 831.5 | 15.938 |
| 832.0 | 16 |
| 832.5 | 15.938 |
| 833.0 | 16 |
| 833.5 | 15.938 |
| 834.0 | 16 |
| 834.5 | 15.938 |
| 835.0 | 16 |
| 835.5 | 15.938 |
| 836.0 | 16 |
| 836.5 | 15.938 |
| 837.0 | 16 |
| 837.5 | 15.938 |
| 838.0 | 16 |
| 838.5 | 15.938 |
| 839.0 | 16 |
| 839.5 | 15.938 |
| 840.0 | 16 |
| 840.5 | 15.938 |
| 841.0 | 15.938 |
| 841.5 | 16 |
| 842.0 | 15.938 |
| 842.5 | 15.938 |
| 843.0 | 15.938 |
| 843.5 | 15.938 |
| 844.0 | 15.938 |
| 844.5 | 15.938 |
| 845.0 | 15.938 |
| 845.5 | 16 |
| 846.0 | 15.938 |
| 846.5 | 16 |
| 847.0 | 15.938 |
| 847.5 | 16 |
| 848.0 | 15.875 |
| 848.5 | 15.938 |
| 849.0 | 15.875 |
| 849.5 | 16 |
| 850.0 | 15.875 |
| 850.5 | 15.938 |
| 851.0 | 15.875 |
| 851.5 | 15.938 |
| 852.0 | 15.875 |
| 852.5 | 15.938 |
| 853.0 | 15.812 |
| 853.5 | 15.938 |
| 854.0 | 15.812 |
| 854.5 | 15.875 |
| 855.0 | 15.812 |
| 855.5 | 15.875 |
| 856.0 | 15.812 |
| 856.5 | 15.875 |
| 857.0 | 15.812 |
| 857.5 | 15.875 |
| 858.0 | 15.75 |
| 858.5 | 15.812 |
| 859.0 | 15.75 |
| 859.5 | 15.812 |
| 860.0 | 15.75 |
| 860.5 | 15.812 |
| 861.0 | 15.75 |
| 861.5 | 15.812 |
| 862.0 | 15.75 |
| 862.5 | 15.812 |
| 863.0 | 15.688 |
| 863.5 | 15.75 |
| 864.0 | 15.688 |
| 864.5 | 15.75 |
| 865.0 | 15.688 |
| 865.5 | 15.688 |
| 866.0 | 15.688 |
| 866.5 | 15.688 |
| 867.0 | 15.688 |
| 867.5 | 15.75 |
| 868.0 | 15.688 |
| 868.5 | 15.75 |
| 869.0 | 15.75 |
| 869.5 | 15.812 |
| 870.0 | 15.688 |
| 870.5 | 15.812 |
| 871.0 | 15.75 |
| 871.5 | 15.812 |
| 872.0 | 15.75 |
| 872.5 | 15.812 |
| 873.0 | 15.75 |
| 873.5 | 15.812 |
| 874.0 | 15.75 |
| 874.5 | 15.812 |
| 875.0 | 15.75 |
| 875.5 | 15.875 |
| 876.0 | 15.812 |
| 876.5 | 15.875 |
| 877.0 | 15.812 |
| 877.5 | 15.875 |
| 878.0 | 15.812 |
| 878.5 | 15.875 |
| 879.0 | 15.812 |
| 879.5 | 15.875 |
| 880.0 | 15.812 |
| 880.5 | 15.875 |
| 881.0 | 15.812 |
| 881.5 | 15.938 |
| 882.0 | 15.875 |
| 882.5 | 15.938 |
| 883.0 | 15.875 |
| 883.5 | 15.938 |
| 884.0 | 15.875 |
| 884.5 | 15.938 |
| 885.0 | 15.875 |
| 885.5 | 15.938 |
| 886.0 | 15.875 |
| 886.5 | 15.938 |
| 887.0 | 15.875 |
| 887.5 | 15.875 |
| 888.0 | 15.875 |
| 888.5 | 15.875 |
| 889.0 | 15.938 |
| 889.5 | 15.875 |
| 890.0 | 15.938 |
| 890.5 | 15.875 |
| 891.0 | 15.938 |
| 891.5 | 15.875 |
| 892.0 | 15.875 |
| 892.5 | 15.812 |
| 893.0 | 15.938 |
| 893.5 | 15.812 |
| 894.0 | 15.875 |
| 894.5 | 15.812 |
| 895.0 | 15.875 |
| 895.5 | 15.812 |
| 896.0 | 15.875 |
| 896.5 | 15.812 |
| 897.0 | 15.875 |
| 897.5 | 15.812 |
| 898.0 | 15.875 |
| 898.5 | 15.812 |
| 899.0 | 15.875 |
| 899.5 | 15.75 |
| 900.0 | 15.812 |
| 900.5 | 15.75 |
| 901.0 | 15.875 |
| 901.5 | 15.75 |
| 902.0 | 15.875 |
| 902.5 | 15.75 |
| 903.0 | 15.875 |
| 903.5 | 15.75 |
| 904.0 | 15.812 |